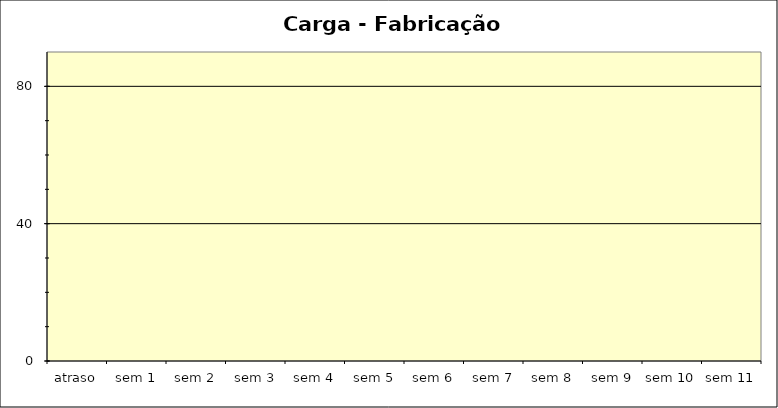
| Category | Series 0 | Series 1 |
|---|---|---|
| atraso | 0 | 0 |
| sem 1 | 0 | 0 |
| sem 2 | 0 | 0 |
| sem 3 | 0 | 0 |
| sem 4 | 0 | 0 |
| sem 5 | 0 | 0 |
| sem 6 | 0 | 0 |
| sem 7 | 0 | 0 |
| sem 8 | 0 | 0 |
| sem 9 | 0 | 0 |
| sem 10 | 0 | 0 |
| sem 11 | 0 | 0 |